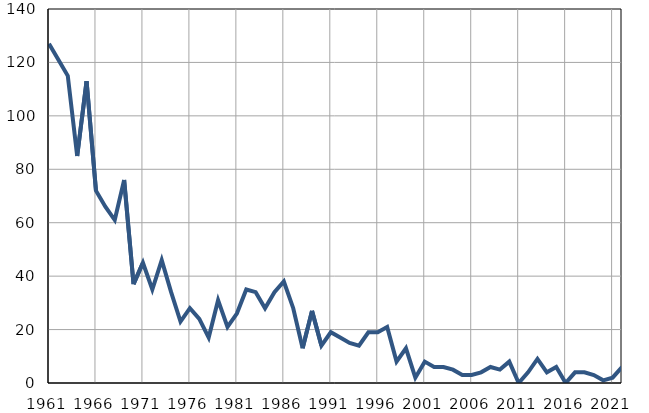
| Category | Умрла 
одојчад |
|---|---|
| 1961.0 | 127 |
| 1962.0 | 121 |
| 1963.0 | 115 |
| 1964.0 | 85 |
| 1965.0 | 113 |
| 1966.0 | 72 |
| 1967.0 | 66 |
| 1968.0 | 61 |
| 1969.0 | 76 |
| 1970.0 | 37 |
| 1971.0 | 45 |
| 1972.0 | 35 |
| 1973.0 | 46 |
| 1974.0 | 34 |
| 1975.0 | 23 |
| 1976.0 | 28 |
| 1977.0 | 24 |
| 1978.0 | 17 |
| 1979.0 | 31 |
| 1980.0 | 21 |
| 1981.0 | 26 |
| 1982.0 | 35 |
| 1983.0 | 34 |
| 1984.0 | 28 |
| 1985.0 | 34 |
| 1986.0 | 38 |
| 1987.0 | 28 |
| 1988.0 | 13 |
| 1989.0 | 27 |
| 1990.0 | 14 |
| 1991.0 | 19 |
| 1992.0 | 17 |
| 1993.0 | 15 |
| 1994.0 | 14 |
| 1995.0 | 19 |
| 1996.0 | 19 |
| 1997.0 | 21 |
| 1998.0 | 8 |
| 1999.0 | 13 |
| 2000.0 | 2 |
| 2001.0 | 8 |
| 2002.0 | 6 |
| 2003.0 | 6 |
| 2004.0 | 5 |
| 2005.0 | 3 |
| 2006.0 | 3 |
| 2007.0 | 4 |
| 2008.0 | 6 |
| 2009.0 | 5 |
| 2010.0 | 8 |
| 2011.0 | 0 |
| 2012.0 | 4 |
| 2013.0 | 9 |
| 2014.0 | 4 |
| 2015.0 | 6 |
| 2016.0 | 0 |
| 2017.0 | 4 |
| 2018.0 | 4 |
| 2019.0 | 3 |
| 2020.0 | 1 |
| 2021.0 | 2 |
| 2022.0 | 6 |